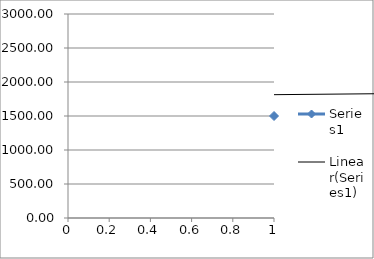
| Category | Series 0 |
|---|---|
| 0 | 1500 |
| 1 | 1917.129 |
| 2 | 2304.42 |
| 3 | 1824.618 |
| 4 | 2120.446 |
| 5 | 2212.609 |
| 6 | 1405.391 |
| 7 | 1925.811 |
| 8 | 1721.376 |
| 9 | 2498.653 |
| 10 | 1948.28 |
| 11 | 2240.877 |
| 12 | 2174.691 |